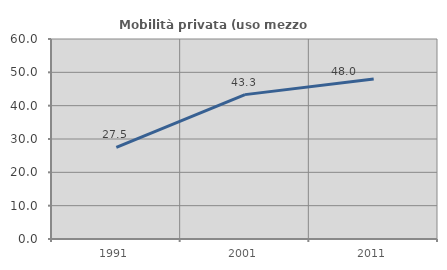
| Category | Mobilità privata (uso mezzo privato) |
|---|---|
| 1991.0 | 27.472 |
| 2001.0 | 43.312 |
| 2011.0 | 48.019 |